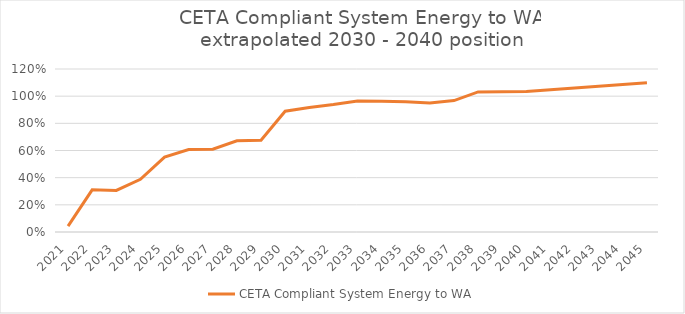
| Category | CETA Compliant System Energy to WA |
|---|---|
| 2021.0 | 0.044 |
| 2022.0 | 0.31 |
| 2023.0 | 0.306 |
| 2024.0 | 0.388 |
| 2025.0 | 0.551 |
| 2026.0 | 0.607 |
| 2027.0 | 0.61 |
| 2028.0 | 0.672 |
| 2029.0 | 0.676 |
| 2030.0 | 0.889 |
| 2031.0 | 0.917 |
| 2032.0 | 0.939 |
| 2033.0 | 0.964 |
| 2034.0 | 0.962 |
| 2035.0 | 0.959 |
| 2036.0 | 0.95 |
| 2037.0 | 0.967 |
| 2038.0 | 1.031 |
| 2039.0 | 1.033 |
| 2040.0 | 1.035 |
| 2041.0 | 1.047 |
| 2042.0 | 1.06 |
| 2043.0 | 1.073 |
| 2044.0 | 1.086 |
| 2045.0 | 1.099 |